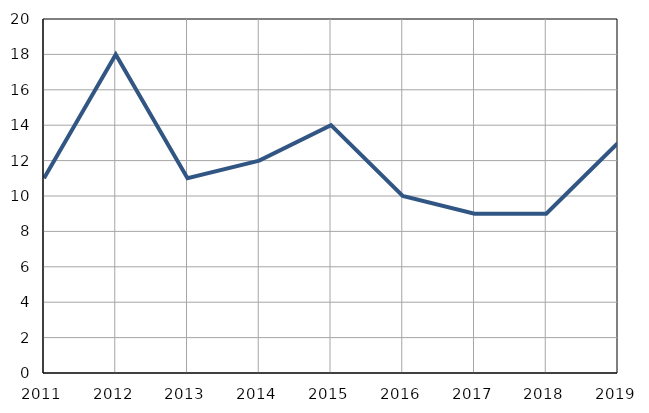
| Category | Infants
deaths |
|---|---|
| 2011.0 | 11 |
| 2012.0 | 18 |
| 2013.0 | 11 |
| 2014.0 | 12 |
| 2015.0 | 14 |
| 2016.0 | 10 |
| 2017.0 | 9 |
| 2018.0 | 9 |
| 2019.0 | 13 |